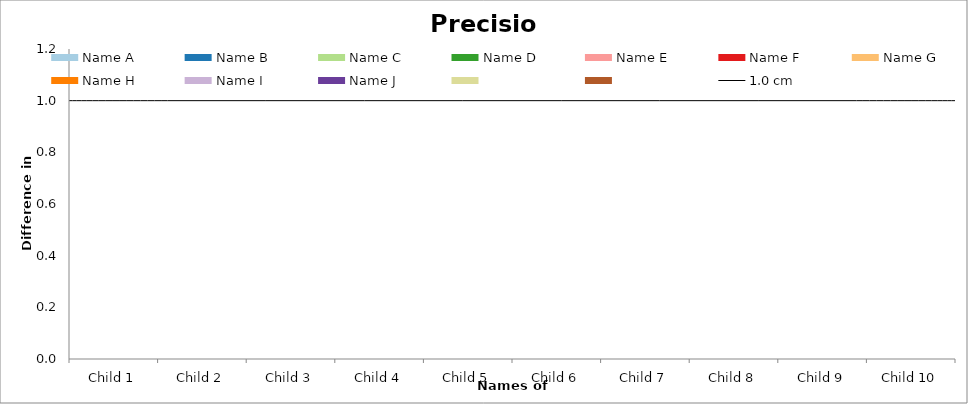
| Category | Name A | Name B | Name C | Name D | Name E | Name F | Name G | Name H | Name I | Name J | Series 10 | Series 11 |
|---|---|---|---|---|---|---|---|---|---|---|---|---|
| Child 1 | 0 | 0 | 0 | 0 | 0 | 0 | 0 | 0 | 0 | 0 | 0 | 0 |
| Child 2 | 0 | 0 | 0 | 0 | 0 | 0 | 0 | 0 | 0 | 0 | 0 | 0 |
| Child 3 | 0 | 0 | 0 | 0 | 0 | 0 | 0 | 0 | 0 | 0 | 0 | 0 |
| Child 4 | 0 | 0 | 0 | 0 | 0 | 0 | 0 | 0 | 0 | 0 | 0 | 0 |
| Child 5 | 0 | 0 | 0 | 0 | 0 | 0 | 0 | 0 | 0 | 0 | 0 | 0 |
| Child 6 | 0 | 0 | 0 | 0 | 0 | 0 | 0 | 0 | 0 | 0 | 0 | 0 |
| Child 7 | 0 | 0 | 0 | 0 | 0 | 0 | 0 | 0 | 0 | 0 | 0 | 0 |
| Child 8 | 0 | 0 | 0 | 0 | 0 | 0 | 0 | 0 | 0 | 0 | 0 | 0 |
| Child 9 | 0 | 0 | 0 | 0 | 0 | 0 | 0 | 0 | 0 | 0 | 0 | 0 |
| Child 10 | 0 | 0 | 0 | 0 | 0 | 0 | 0 | 0 | 0 | 0 | 0 | 0 |